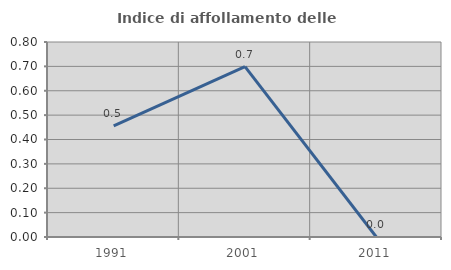
| Category | Indice di affollamento delle abitazioni  |
|---|---|
| 1991.0 | 0.456 |
| 2001.0 | 0.699 |
| 2011.0 | 0 |